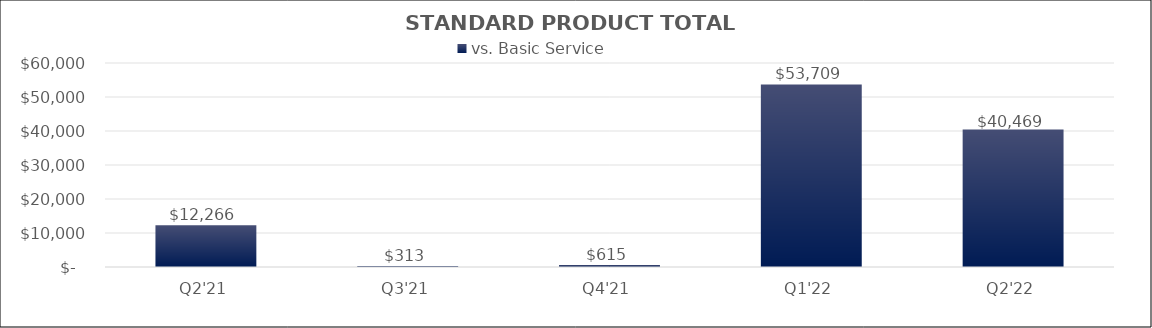
| Category | vs. Basic Service |
|---|---|
| Q2'21 | 12265.67 |
| Q3'21 | 312.535 |
| Q4'21 | 615.307 |
| Q1'22 | 53708.915 |
| Q2'22 | 40469.084 |